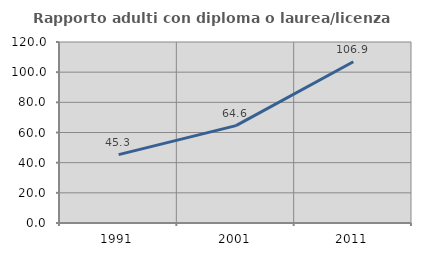
| Category | Rapporto adulti con diploma o laurea/licenza media  |
|---|---|
| 1991.0 | 45.32 |
| 2001.0 | 64.553 |
| 2011.0 | 106.897 |